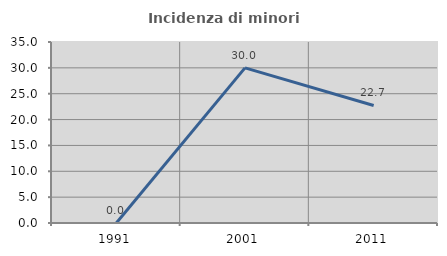
| Category | Incidenza di minori stranieri |
|---|---|
| 1991.0 | 0 |
| 2001.0 | 30 |
| 2011.0 | 22.727 |